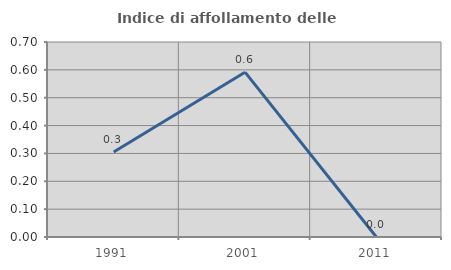
| Category | Indice di affollamento delle abitazioni  |
|---|---|
| 1991.0 | 0.305 |
| 2001.0 | 0.592 |
| 2011.0 | 0 |